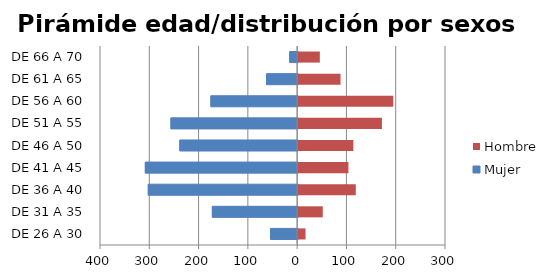
| Category | Mujer | Hombre |
|---|---|---|
| DE 26 A 30 | -55 | 15 |
| DE 31 A 35 | -173 | 50 |
| DE 36 A 40 | -303 | 117 |
| DE 41 A 45 | -309 | 102 |
| DE 46 A 50 | -239 | 112 |
| DE 51 A 55 | -257 | 170 |
| DE 56 A 60 | -176 | 193 |
| DE 61 A 65 | -63 | 86 |
| DE 66 A 70 | -16 | 44 |